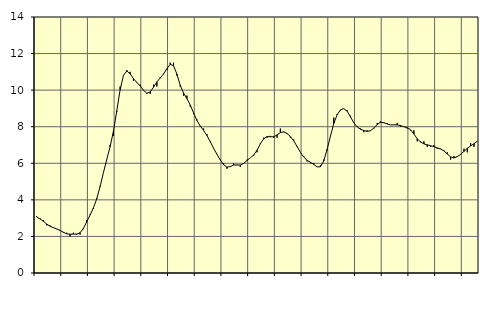
| Category | Piggar | Series 1 |
|---|---|---|
| nan | 3.1 | 3.06 |
| 87.0 | 3 | 2.96 |
| 87.0 | 2.9 | 2.83 |
| 87.0 | 2.6 | 2.68 |
| nan | 2.6 | 2.56 |
| 88.0 | 2.5 | 2.48 |
| 88.0 | 2.4 | 2.41 |
| 88.0 | 2.3 | 2.33 |
| nan | 2.2 | 2.23 |
| 89.0 | 2.2 | 2.14 |
| 89.0 | 2 | 2.12 |
| 89.0 | 2.2 | 2.13 |
| nan | 2.1 | 2.13 |
| 90.0 | 2.1 | 2.2 |
| 90.0 | 2.4 | 2.44 |
| 90.0 | 2.9 | 2.8 |
| nan | 3.2 | 3.17 |
| 91.0 | 3.5 | 3.56 |
| 91.0 | 4.1 | 4.06 |
| 91.0 | 4.7 | 4.73 |
| nan | 5.5 | 5.49 |
| 92.0 | 6.2 | 6.21 |
| 92.0 | 7 | 6.91 |
| 92.0 | 7.5 | 7.75 |
| nan | 8.8 | 8.87 |
| 93.0 | 10.2 | 10.02 |
| 93.0 | 10.8 | 10.81 |
| 93.0 | 11.1 | 11.05 |
| nan | 11 | 10.89 |
| 94.0 | 10.5 | 10.63 |
| 94.0 | 10.4 | 10.42 |
| 94.0 | 10.3 | 10.23 |
| nan | 10 | 9.99 |
| 95.0 | 9.8 | 9.83 |
| 95.0 | 9.8 | 9.9 |
| 95.0 | 10.3 | 10.16 |
| nan | 10.2 | 10.45 |
| 96.0 | 10.7 | 10.66 |
| 96.0 | 10.9 | 10.88 |
| 96.0 | 11.1 | 11.17 |
| nan | 11.5 | 11.41 |
| 97.0 | 11.5 | 11.34 |
| 97.0 | 10.8 | 10.88 |
| 97.0 | 10.2 | 10.27 |
| nan | 9.7 | 9.84 |
| 98.0 | 9.7 | 9.54 |
| 98.0 | 9.1 | 9.19 |
| 98.0 | 8.7 | 8.76 |
| nan | 8.4 | 8.34 |
| 99.0 | 8 | 8.04 |
| 99.0 | 7.9 | 7.8 |
| 99.0 | 7.6 | 7.52 |
| nan | 7.2 | 7.18 |
| 0.0 | 6.8 | 6.82 |
| 0.0 | 6.5 | 6.49 |
| 0.0 | 6.2 | 6.18 |
| nan | 6 | 5.92 |
| 1.0 | 5.7 | 5.79 |
| 1.0 | 5.8 | 5.82 |
| 1.0 | 6 | 5.9 |
| nan | 5.9 | 5.91 |
| 2.0 | 5.8 | 5.9 |
| 2.0 | 6 | 5.99 |
| 2.0 | 6.2 | 6.15 |
| nan | 6.3 | 6.3 |
| 3.0 | 6.4 | 6.45 |
| 3.0 | 6.6 | 6.71 |
| 3.0 | 7.1 | 7.06 |
| nan | 7.4 | 7.34 |
| 4.0 | 7.4 | 7.46 |
| 4.0 | 7.5 | 7.45 |
| 4.0 | 7.4 | 7.45 |
| nan | 7.4 | 7.55 |
| 5.0 | 7.9 | 7.68 |
| 5.0 | 7.7 | 7.72 |
| 5.0 | 7.6 | 7.63 |
| nan | 7.4 | 7.46 |
| 6.0 | 7.3 | 7.23 |
| 6.0 | 6.9 | 6.92 |
| 6.0 | 6.6 | 6.6 |
| nan | 6.4 | 6.34 |
| 7.0 | 6.1 | 6.16 |
| 7.0 | 6 | 6.06 |
| 7.0 | 6 | 5.94 |
| nan | 5.8 | 5.8 |
| 8.0 | 5.9 | 5.81 |
| 8.0 | 6.2 | 6.13 |
| 8.0 | 6.7 | 6.76 |
| nan | 7.5 | 7.48 |
| 9.0 | 8.5 | 8.18 |
| 9.0 | 8.7 | 8.65 |
| 9.0 | 8.9 | 8.92 |
| nan | 9 | 8.99 |
| 10.0 | 8.9 | 8.85 |
| 10.0 | 8.6 | 8.54 |
| 10.0 | 8.2 | 8.22 |
| nan | 8 | 7.99 |
| 11.0 | 7.9 | 7.86 |
| 11.0 | 7.7 | 7.79 |
| 11.0 | 7.8 | 7.75 |
| nan | 7.8 | 7.78 |
| 12.0 | 7.9 | 7.93 |
| 12.0 | 8.2 | 8.12 |
| 12.0 | 8.3 | 8.24 |
| nan | 8.2 | 8.22 |
| 13.0 | 8.2 | 8.15 |
| 13.0 | 8.1 | 8.1 |
| 13.0 | 8.1 | 8.1 |
| nan | 8.2 | 8.1 |
| 14.0 | 8 | 8.06 |
| 14.0 | 8 | 8 |
| 14.0 | 7.9 | 7.95 |
| nan | 7.8 | 7.83 |
| 15.0 | 7.8 | 7.6 |
| 15.0 | 7.2 | 7.34 |
| 15.0 | 7.2 | 7.16 |
| nan | 7.2 | 7.06 |
| 16.0 | 6.9 | 7.01 |
| 16.0 | 6.9 | 6.96 |
| 16.0 | 7 | 6.91 |
| nan | 6.8 | 6.84 |
| 17.0 | 6.8 | 6.78 |
| 17.0 | 6.7 | 6.68 |
| 17.0 | 6.6 | 6.51 |
| nan | 6.2 | 6.35 |
| 18.0 | 6.4 | 6.29 |
| 18.0 | 6.4 | 6.36 |
| 18.0 | 6.5 | 6.49 |
| nan | 6.8 | 6.65 |
| 19.0 | 6.6 | 6.82 |
| 19.0 | 7.1 | 6.95 |
| 19.0 | 6.9 | 7.07 |
| nan | 7.2 | 7.21 |